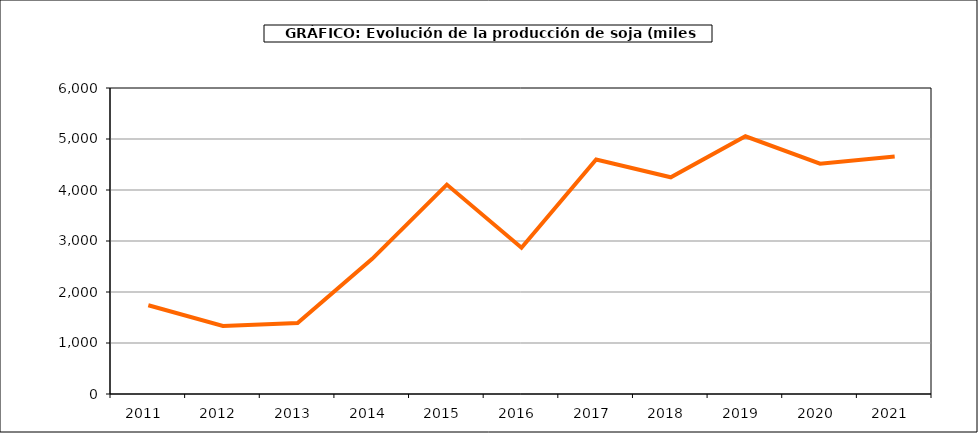
| Category | Producción |
|---|---|
| 2011.0 | 1740 |
| 2012.0 | 1333 |
| 2013.0 | 1390 |
| 2014.0 | 2650 |
| 2015.0 | 4106 |
| 2016.0 | 2869 |
| 2017.0 | 4599 |
| 2018.0 | 4249 |
| 2019.0 | 5053 |
| 2020.0 | 4515 |
| 2021.0 | 4658 |